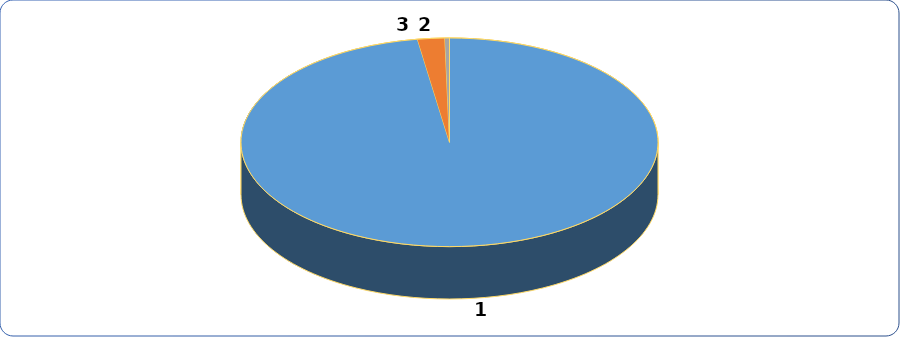
| Category | Series 0 | Series 1 |
|---|---|---|
| 0 | 15577947 | 0.975 |
| 1 | 335447.4 | 0.021 |
| 2 | 56854.45 | 0.004 |